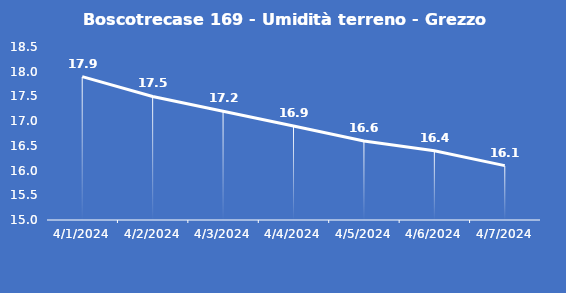
| Category | Boscotrecase 169 - Umidità terreno - Grezzo (%VWC) |
|---|---|
| 4/1/24 | 17.9 |
| 4/2/24 | 17.5 |
| 4/3/24 | 17.2 |
| 4/4/24 | 16.9 |
| 4/5/24 | 16.6 |
| 4/6/24 | 16.4 |
| 4/7/24 | 16.1 |